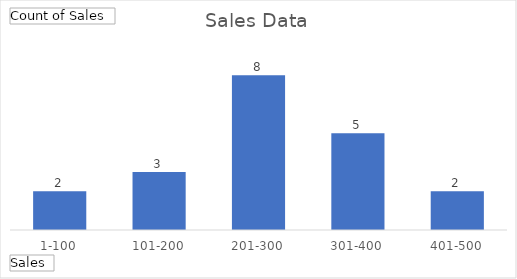
| Category | Total |
|---|---|
| 1-100 | 2 |
| 101-200 | 3 |
| 201-300 | 8 |
| 301-400 | 5 |
| 401-500 | 2 |